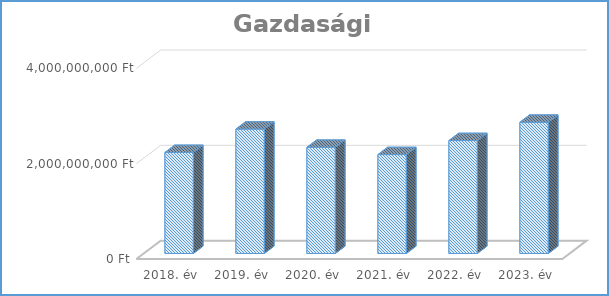
| Category | Gazdasági ügyek |
|---|---|
| 2018. év | 2120133501 |
| 2019. év | 2610705640 |
| 2020. év | 2228702368 |
| 2021. év | 2075751558 |
| 2022. év | 2369995778 |
| 2023. év | 2753975645 |